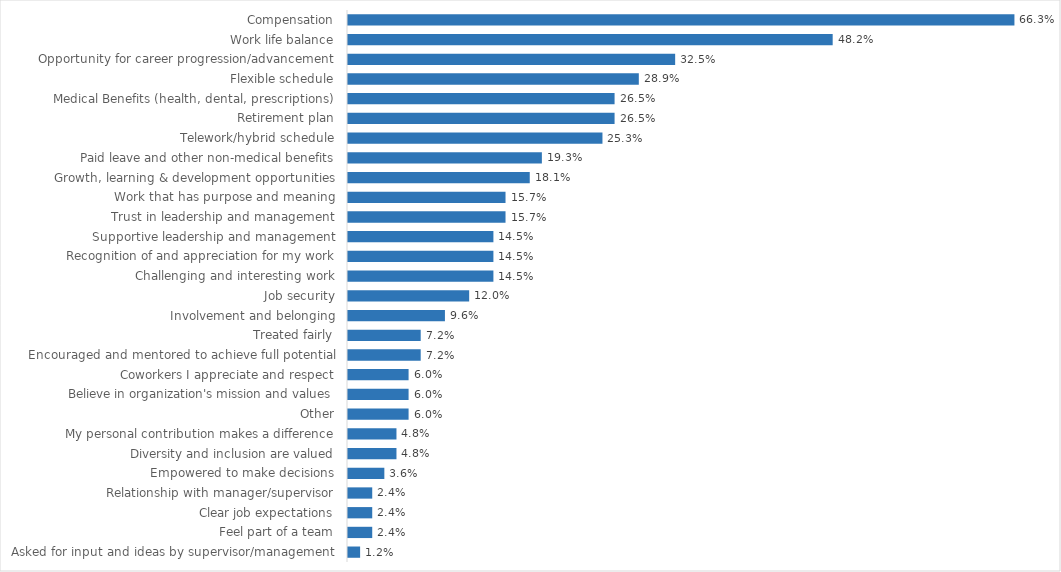
| Category | Mental Health |
|---|---|
| Compensation | 0.663 |
| Work life balance | 0.482 |
| Opportunity for career progression/advancement | 0.325 |
| Flexible schedule | 0.289 |
| Medical Benefits (health, dental, prescriptions) | 0.265 |
| Retirement plan | 0.265 |
| Telework/hybrid schedule | 0.253 |
| Paid leave and other non-medical benefits | 0.193 |
| Growth, learning & development opportunities | 0.181 |
| Work that has purpose and meaning | 0.157 |
| Trust in leadership and management | 0.157 |
| Supportive leadership and management | 0.145 |
| Recognition of and appreciation for my work | 0.145 |
| Challenging and interesting work | 0.145 |
| Job security | 0.12 |
| Involvement and belonging | 0.096 |
| Treated fairly | 0.072 |
| Encouraged and mentored to achieve full potential | 0.072 |
| Coworkers I appreciate and respect | 0.06 |
| Believe in organization's mission and values | 0.06 |
| Other | 0.06 |
| My personal contribution makes a difference | 0.048 |
| Diversity and inclusion are valued | 0.048 |
| Empowered to make decisions | 0.036 |
| Relationship with manager/supervisor | 0.024 |
| Clear job expectations | 0.024 |
| Feel part of a team | 0.024 |
| Asked for input and ideas by supervisor/management | 0.012 |